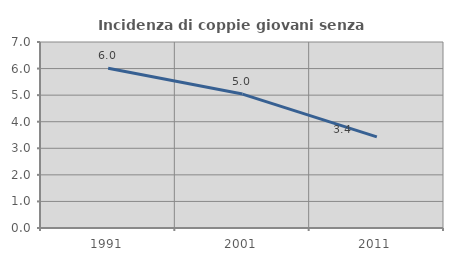
| Category | Incidenza di coppie giovani senza figli |
|---|---|
| 1991.0 | 6.01 |
| 2001.0 | 5.04 |
| 2011.0 | 3.431 |